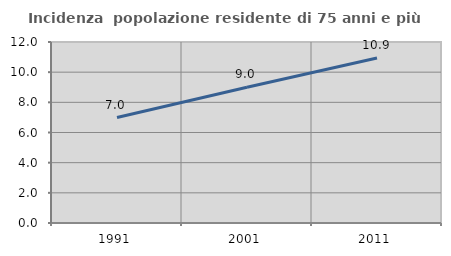
| Category | Incidenza  popolazione residente di 75 anni e più |
|---|---|
| 1991.0 | 6.99 |
| 2001.0 | 9.003 |
| 2011.0 | 10.939 |